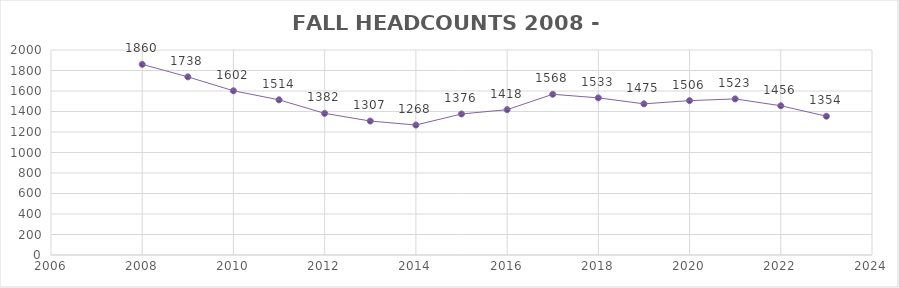
| Category | Series 0 |
|---|---|
| 2008.0 | 1860 |
| 2009.0 | 1738 |
| 2010.0 | 1602 |
| 2011.0 | 1514 |
| 2012.0 | 1382 |
| 2013.0 | 1307 |
| 2014.0 | 1268 |
| 2015.0 | 1376 |
| 2016.0 | 1418 |
| 2017.0 | 1568 |
| 2018.0 | 1533 |
| 2019.0 | 1475 |
| 2020.0 | 1506 |
| 2021.0 | 1523 |
| 2022.0 | 1456 |
| 2023.0 | 1354 |